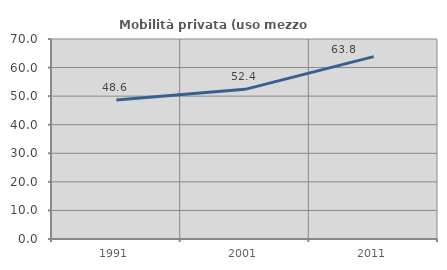
| Category | Mobilità privata (uso mezzo privato) |
|---|---|
| 1991.0 | 48.621 |
| 2001.0 | 52.381 |
| 2011.0 | 63.833 |